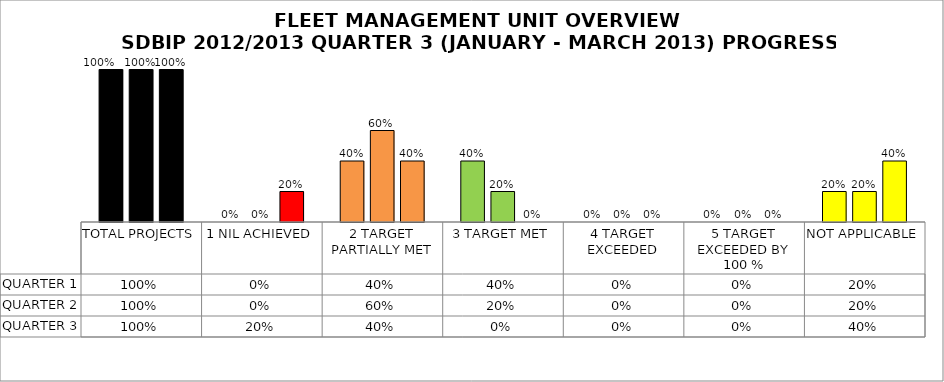
| Category | QUARTER 1 | QUARTER 2 | QUARTER 3 |
|---|---|---|---|
| TOTAL PROJECTS | 1 | 1 | 1 |
| 1 NIL ACHIEVED | 0 | 0 | 0.2 |
| 2 TARGET PARTIALLY MET | 0.4 | 0.6 | 0.4 |
| 3 TARGET MET | 0.4 | 0.2 | 0 |
| 4 TARGET EXCEEDED | 0 | 0 | 0 |
| 5 TARGET EXCEEDED BY 100 % | 0 | 0 | 0 |
| NOT APPLICABLE | 0.2 | 0.2 | 0.4 |